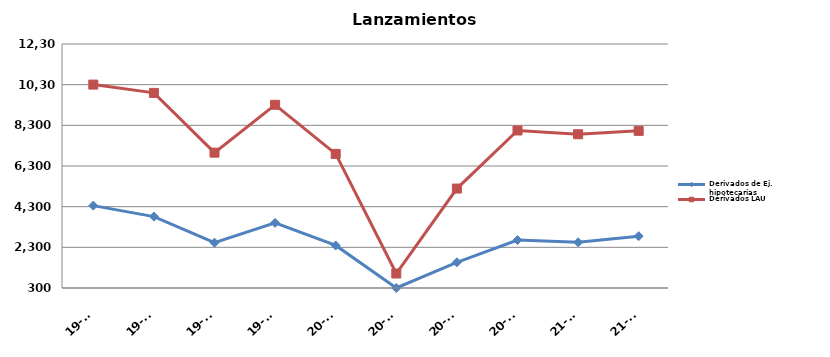
| Category | Derivados de Ej. hipotecarias | Derivados LAU |
|---|---|---|
| 19-T1 | 4351 | 10304 |
| 19-T2 | 3812 | 9896 |
| 19-T3 | 2527 | 6957 |
| 19-T4 | 3503 | 9310 |
| 20-T1 | 2392 | 6896 |
| 20-T2 | 300 | 1013 |
| 20-T3 | 1564 | 5190 |
| 20-T4 | 2659 | 8046 |
| 21-T1 | 2548 | 7862 |
| 21-T2 | 2849 | 8028 |